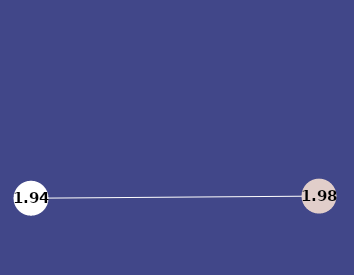
| Category | Series 0 |
|---|---|
| 0 | 1.942 |
| 1 | 1.975 |